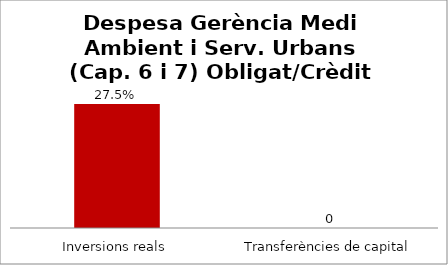
| Category | Series 0 |
|---|---|
| Inversions reals | 0.275 |
| Transferències de capital | 0 |